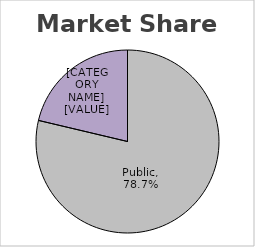
| Category | Series 0 |
|---|---|
| Public | 0.787 |
| Non Public | 0.213 |